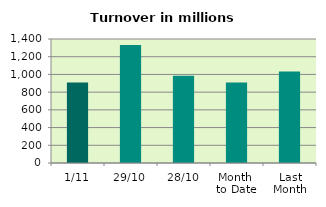
| Category | Series 0 |
|---|---|
| 1/11 | 908.321 |
| 29/10 | 1333.2 |
| 28/10 | 983.674 |
| Month 
to Date | 908.321 |
| Last
Month | 1032.218 |